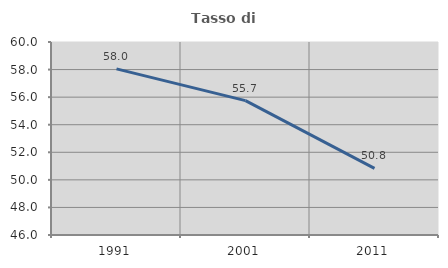
| Category | Tasso di occupazione   |
|---|---|
| 1991.0 | 58.047 |
| 2001.0 | 55.749 |
| 2011.0 | 50.834 |